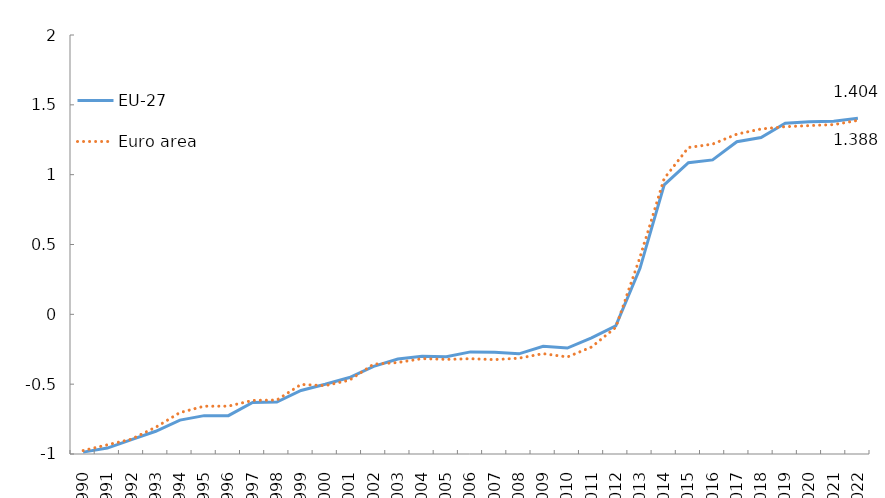
| Category | EU-27 | Euro area |
|---|---|---|
| 1990.0 | -0.987 | -0.975 |
| 1991.0 | -0.958 | -0.934 |
| 1992.0 | -0.897 | -0.894 |
| 1993.0 | -0.837 | -0.808 |
| 1994.0 | -0.758 | -0.704 |
| 1995.0 | -0.725 | -0.658 |
| 1996.0 | -0.725 | -0.658 |
| 1997.0 | -0.63 | -0.616 |
| 1998.0 | -0.629 | -0.614 |
| 1999.0 | -0.545 | -0.502 |
| 2000.0 | -0.501 | -0.511 |
| 2001.0 | -0.453 | -0.471 |
| 2002.0 | -0.372 | -0.357 |
| 2003.0 | -0.32 | -0.345 |
| 2004.0 | -0.301 | -0.317 |
| 2005.0 | -0.304 | -0.323 |
| 2006.0 | -0.269 | -0.318 |
| 2007.0 | -0.272 | -0.324 |
| 2008.0 | -0.283 | -0.314 |
| 2009.0 | -0.229 | -0.281 |
| 2010.0 | -0.242 | -0.305 |
| 2011.0 | -0.168 | -0.234 |
| 2012.0 | -0.083 | -0.093 |
| 2013.0 | 0.329 | 0.408 |
| 2014.0 | 0.927 | 0.973 |
| 2015.0 | 1.086 | 1.194 |
| 2016.0 | 1.106 | 1.219 |
| 2017.0 | 1.236 | 1.29 |
| 2018.0 | 1.266 | 1.327 |
| 2019.0 | 1.369 | 1.344 |
| 2020.0 | 1.38 | 1.351 |
| 2021.0 | 1.383 | 1.358 |
| 2022.0 | 1.404 | 1.388 |